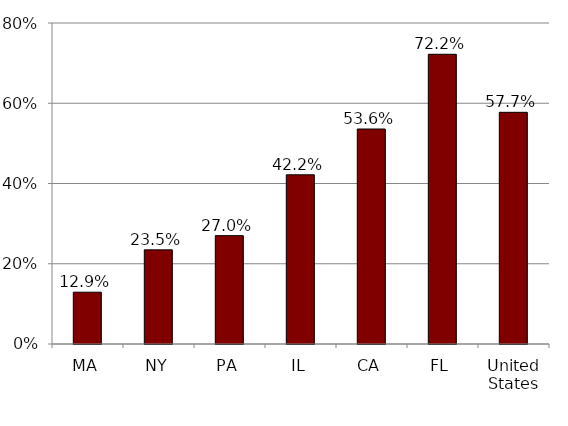
| Category | Series 0 |
|---|---|
| MA | 0.129 |
| NY | 0.235 |
| PA | 0.27 |
| IL | 0.422 |
| CA | 0.536 |
| FL | 0.722 |
| United States | 0.577 |